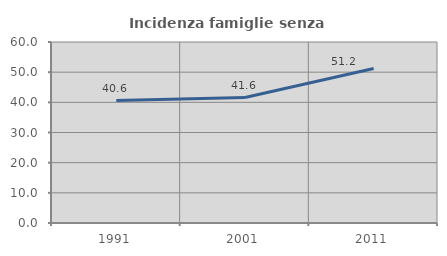
| Category | Incidenza famiglie senza nuclei |
|---|---|
| 1991.0 | 40.586 |
| 2001.0 | 41.593 |
| 2011.0 | 51.244 |